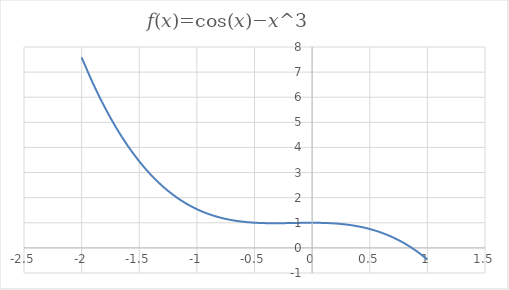
| Category | Series 0 |
|---|---|
| -2.0 | 7.584 |
| -1.9 | 6.536 |
| -1.8 | 5.605 |
| -1.7 | 4.784 |
| -1.6 | 4.067 |
| -1.5 | 3.446 |
| -1.4 | 2.914 |
| -1.3 | 2.464 |
| -1.2 | 2.09 |
| -1.1 | 1.785 |
| -1.0 | 1.54 |
| -0.9 | 1.351 |
| -0.8 | 1.209 |
| -0.7 | 1.108 |
| -0.6 | 1.041 |
| -0.5 | 1.003 |
| -0.4 | 0.985 |
| -0.3 | 0.982 |
| -0.2 | 0.988 |
| -0.1 | 0.996 |
| 0.0 | 1 |
| 0.1 | 0.994 |
| 0.2 | 0.972 |
| 0.3 | 0.928 |
| 0.4 | 0.857 |
| 0.5 | 0.753 |
| 0.6 | 0.609 |
| 0.7 | 0.422 |
| 0.8 | 0.185 |
| 0.9 | -0.107 |
| 1.0 | -0.46 |